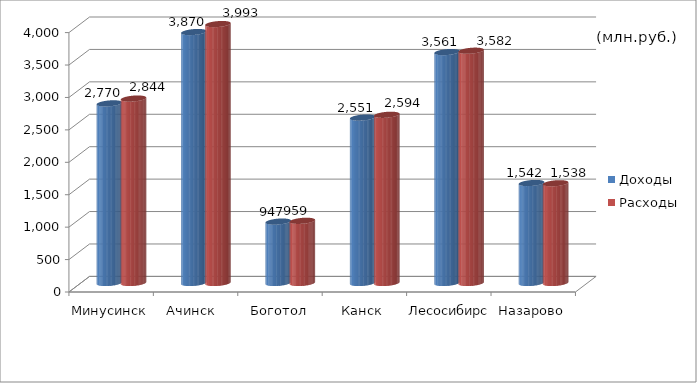
| Category | Доходы | Расходы |
|---|---|---|
| Минусинск | 2770 | 2844 |
| Ачинск  | 3870 | 3993 |
| Боготол | 947 | 959 |
| Канск | 2551 | 2594 |
| Лесосибирск | 3561 | 3582 |
| Назарово | 1542 | 1538 |